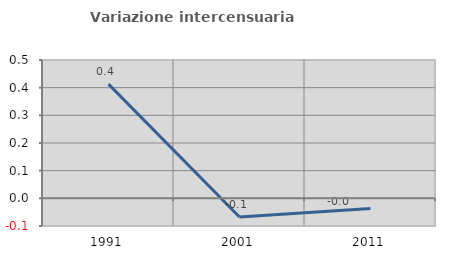
| Category | Variazione intercensuaria annua |
|---|---|
| 1991.0 | 0.413 |
| 2001.0 | -0.067 |
| 2011.0 | -0.037 |